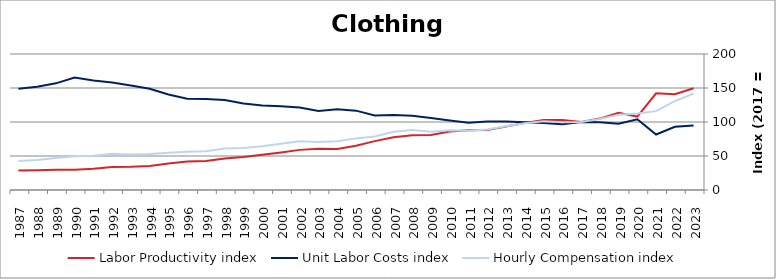
| Category | Labor Productivity index | Unit Labor Costs index | Hourly Compensation index |
|---|---|---|---|
| 2023.0 | 149.599 | 94.828 | 141.862 |
| 2022.0 | 140.7 | 92.916 | 130.732 |
| 2021.0 | 142.177 | 81.56 | 115.959 |
| 2020.0 | 107.957 | 104.09 | 112.372 |
| 2019.0 | 113.604 | 97.457 | 110.715 |
| 2018.0 | 104.993 | 99.498 | 104.466 |
| 2017.0 | 100 | 100 | 100 |
| 2016.0 | 102.888 | 96.763 | 99.558 |
| 2015.0 | 102.862 | 98.456 | 101.274 |
| 2014.0 | 98.588 | 99.504 | 98.099 |
| 2013.0 | 93.302 | 100.593 | 93.856 |
| 2012.0 | 88.279 | 100.848 | 89.027 |
| 2011.0 | 87.93 | 98.939 | 86.996 |
| 2010.0 | 86.085 | 102.074 | 87.871 |
| 2009.0 | 80.837 | 105.789 | 85.517 |
| 2008.0 | 80.633 | 109.288 | 88.122 |
| 2007.0 | 77.688 | 110.353 | 85.731 |
| 2006.0 | 71.854 | 109.607 | 78.758 |
| 2005.0 | 65.034 | 116.717 | 75.906 |
| 2004.0 | 60.472 | 118.587 | 71.712 |
| 2003.0 | 60.718 | 116.19 | 70.548 |
| 2002.0 | 59.007 | 121.212 | 71.523 |
| 2001.0 | 55.257 | 123.323 | 68.144 |
| 2000.0 | 51.78 | 124.26 | 64.342 |
| 1999.0 | 48.389 | 127.37 | 61.633 |
| 1998.0 | 46.212 | 132.233 | 61.108 |
| 1997.0 | 42.616 | 133.976 | 57.095 |
| 1996.0 | 41.948 | 134.277 | 56.326 |
| 1995.0 | 39.112 | 140.451 | 54.933 |
| 1994.0 | 35.441 | 148.999 | 52.806 |
| 1993.0 | 34.022 | 153.807 | 52.328 |
| 1992.0 | 33.777 | 158.022 | 53.376 |
| 1991.0 | 31.197 | 160.988 | 50.223 |
| 1990.0 | 29.907 | 165.5 | 49.497 |
| 1989.0 | 29.959 | 156.852 | 46.991 |
| 1988.0 | 29.12 | 151.986 | 44.259 |
| 1987.0 | 28.727 | 149.06 | 42.82 |